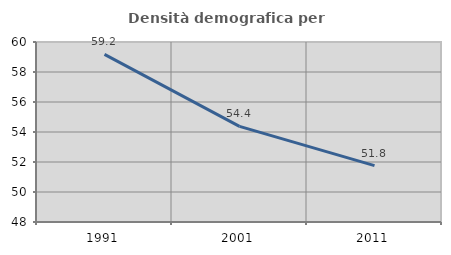
| Category | Densità demografica |
|---|---|
| 1991.0 | 59.179 |
| 2001.0 | 54.373 |
| 2011.0 | 51.76 |